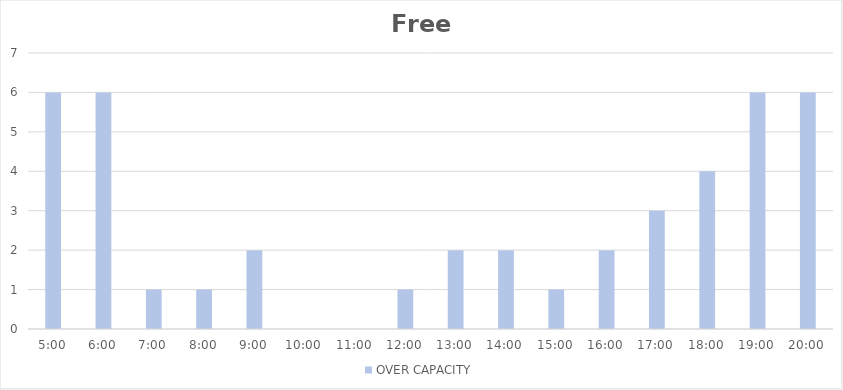
| Category | OVER CAPACITY |
|---|---|
| 0.20833333333333334 | 6 |
| 0.25 | 6 |
| 0.2916666666666667 | 1 |
| 0.3333333333333333 | 1 |
| 0.375 | 2 |
| 0.4166666666666667 | 0 |
| 0.4583333333333333 | 0 |
| 0.5 | 1 |
| 0.5416666666666666 | 2 |
| 0.5833333333333334 | 2 |
| 0.625 | 1 |
| 0.6666666666666666 | 2 |
| 0.7083333333333334 | 3 |
| 0.75 | 4 |
| 0.7916666666666666 | 6 |
| 0.8333333333333334 | 6 |